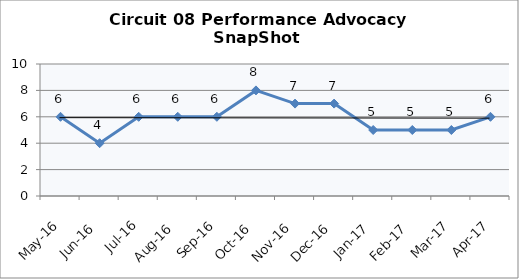
| Category | Circuit 08 |
|---|---|
| May-16 | 6 |
| Jun-16 | 4 |
| Jul-16 | 6 |
| Aug-16 | 6 |
| Sep-16 | 6 |
| Oct-16 | 8 |
| Nov-16 | 7 |
| Dec-16 | 7 |
| Jan-17 | 5 |
| Feb-17 | 5 |
| Mar-17 | 5 |
| Apr-17 | 6 |